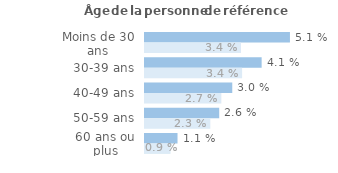
| Category | Series 1 | Series 0 |
|---|---|---|
| Moins de 30 ans | 0.051 | 0.034 |
| 30-39 ans | 0.041 | 0.034 |
| 40-49 ans | 0.03 | 0.027 |
| 50-59 ans | 0.026 | 0.023 |
| 60 ans ou plus | 0.011 | 0.009 |